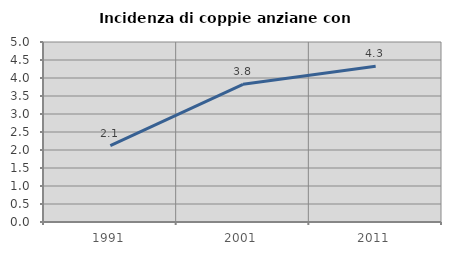
| Category | Incidenza di coppie anziane con figli |
|---|---|
| 1991.0 | 2.121 |
| 2001.0 | 3.825 |
| 2011.0 | 4.324 |